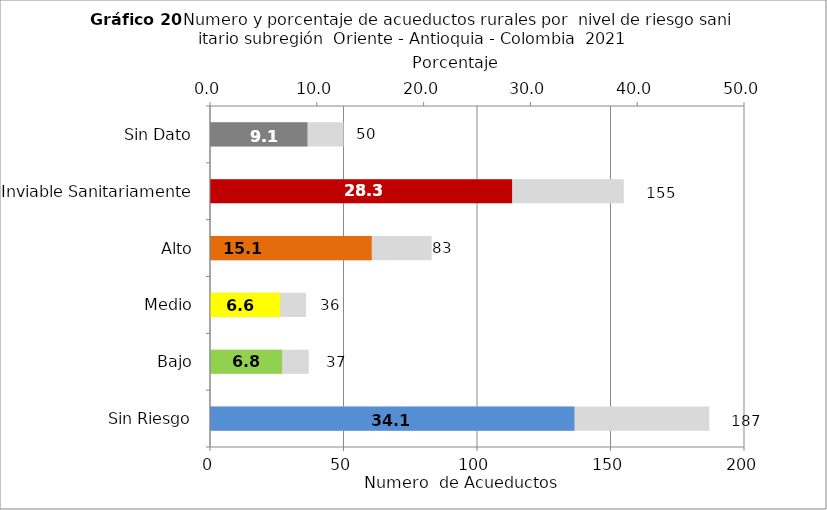
| Category | Número de Sistemas |
|---|---|
| Sin Riesgo | 187 |
| Bajo | 37 |
| Medio | 36 |
| Alto | 83 |
| Inviable Sanitariamente | 155 |
| Sin Dato | 50 |